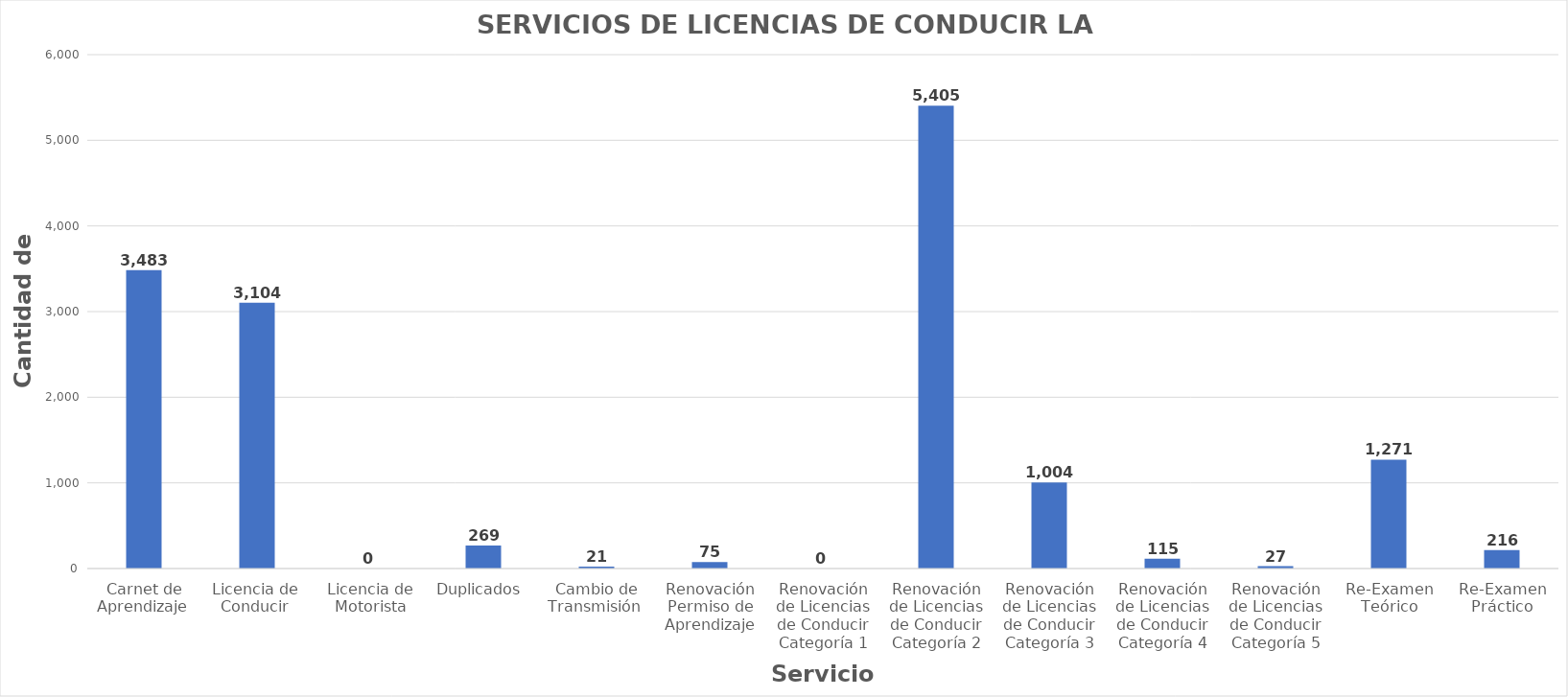
| Category | Series 0 |
|---|---|
| Carnet de Aprendizaje  | 3483 |
| Licencia de  Conducir  | 3104 |
| Licencia de Motorista | 0 |
| Duplicados  | 269 |
| Cambio de Transmisión  | 21 |
| Renovación Permiso de Aprendizaje | 75 |
| Renovación de Licencias de Conducir Categoría 1 | 0 |
| Renovación de Licencias de Conducir Categoría 2 | 5405 |
| Renovación de Licencias de Conducir Categoría 3 | 1004 |
| Renovación de Licencias de Conducir Categoría 4 | 115 |
| Renovación de Licencias de Conducir Categoría 5 | 27 |
| Re-Examen Teórico | 1271 |
| Re-Examen Práctico | 216 |